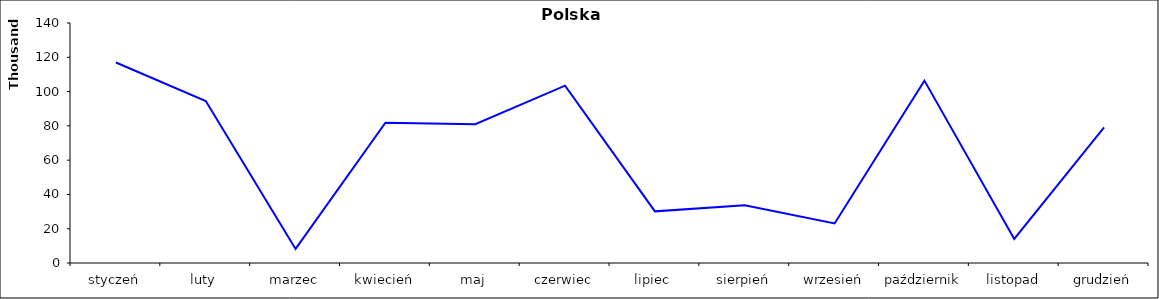
| Category | Polska Sprzedaż |
|---|---|
| styczeń | 116956.352 |
| luty | 94501.573 |
| marzec | 8215 |
| kwiecień | 81836.233 |
| maj | 80962.191 |
| czerwiec | 103462.161 |
| lipiec | 30123.647 |
| sierpień | 33669.079 |
| wrzesień | 23037.328 |
| październik | 106402.88 |
| listopad | 14074.065 |
| grudzień | 79065.479 |